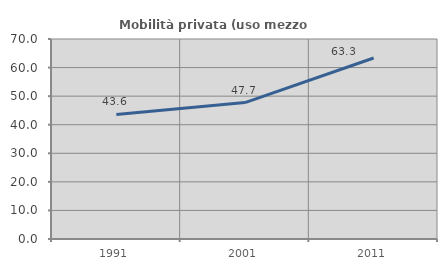
| Category | Mobilità privata (uso mezzo privato) |
|---|---|
| 1991.0 | 43.615 |
| 2001.0 | 47.745 |
| 2011.0 | 63.343 |